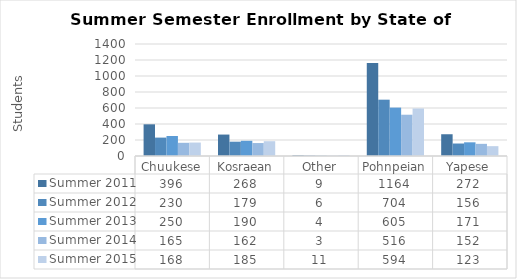
| Category | Summer 2011 | Summer 2012 | Summer 2013 | Summer 2014 | Summer 2015 |
|---|---|---|---|---|---|
| Chuukese | 396 | 230 | 250 | 165 | 168 |
| Kosraean | 268 | 179 | 190 | 162 | 185 |
| Other | 9 | 6 | 4 | 3 | 11 |
| Pohnpeian | 1164 | 704 | 605 | 516 | 594 |
| Yapese | 272 | 156 | 171 | 152 | 123 |